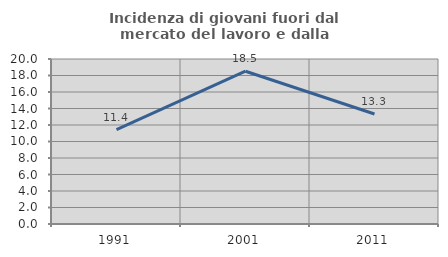
| Category | Incidenza di giovani fuori dal mercato del lavoro e dalla formazione  |
|---|---|
| 1991.0 | 11.429 |
| 2001.0 | 18.519 |
| 2011.0 | 13.333 |